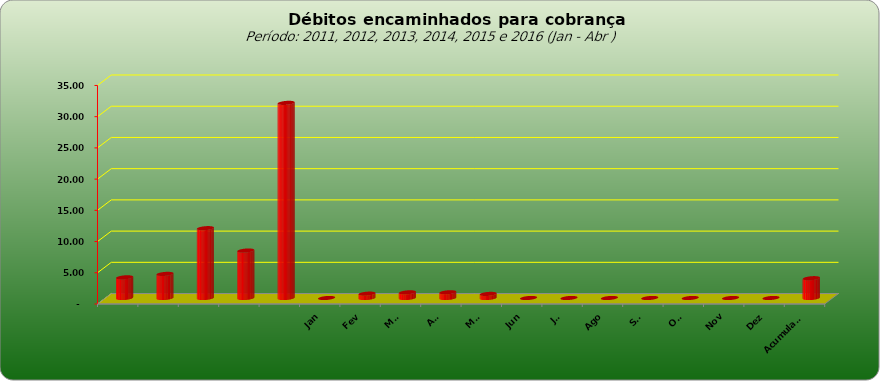
| Category |  3.309.443,02  |
|---|---|
|  | 3309443.02 |
|  | 3859728.44 |
|  | 11181928.25 |
|  | 7600526.01 |
|  | 31248623.5 |
| Jan | 0 |
| Fev | 695716.82 |
| Mar | 906394.22 |
| Abr | 915013.51 |
| Mai | 654375.79 |
| Jun | 0 |
| Jul | 0 |
| Ago | 0 |
| Set | 0 |
| Out | 0 |
| Nov | 0 |
| Dez | 0 |
| Acumulado | 3171500.34 |